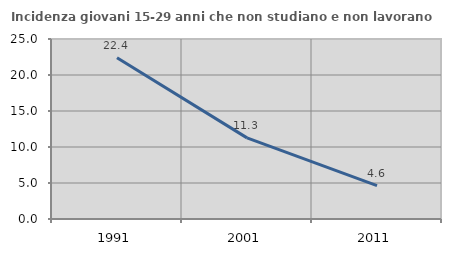
| Category | Incidenza giovani 15-29 anni che non studiano e non lavorano  |
|---|---|
| 1991.0 | 22.4 |
| 2001.0 | 11.268 |
| 2011.0 | 4.624 |